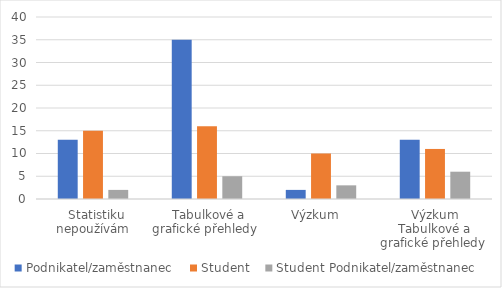
| Category | Podnikatel/zaměstnanec   | Student   | Student Podnikatel/zaměstnanec   |
|---|---|---|---|
|   Statistiku nepoužívám | 13 | 15 | 2 |
|  Tabulkové a grafické přehledy  | 35 | 16 | 5 |
| Výzkum   | 2 | 10 | 3 |
| Výzkum Tabulkové a grafické přehledy  | 13 | 11 | 6 |